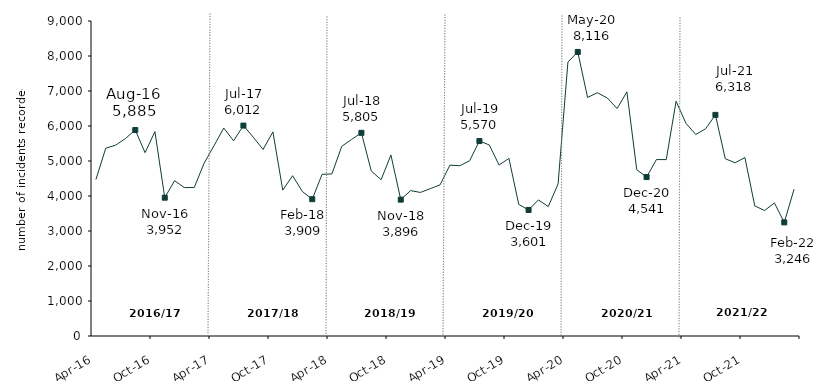
| Category | Series 0 |
|---|---|
| 2016-04-01 | 4472 |
| 2016-05-01 | 5366 |
| 2016-06-01 | 5452 |
| 2016-07-01 | 5641 |
| 2016-08-01 | 5885 |
| 2016-09-01 | 5238 |
| 2016-10-01 | 5840 |
| 2016-11-01 | 3952 |
| 2016-12-01 | 4437 |
| 2017-01-01 | 4240 |
| 2017-02-01 | 4244 |
| 2017-03-01 | 4936 |
| 2017-04-01 | 5433 |
| 2017-05-01 | 5941 |
| 2017-06-01 | 5577 |
| 2017-07-01 | 6012 |
| 2017-08-01 | 5681 |
| 2017-09-01 | 5329 |
| 2017-10-01 | 5832 |
| 2017-11-01 | 4167 |
| 2017-12-01 | 4580 |
| 2018-01-01 | 4127 |
| 2018-02-01 | 3909 |
| 2018-03-01 | 4619 |
| 2018-04-01 | 4631 |
| 2018-05-01 | 5420 |
| 2018-06-01 | 5616 |
| 2018-07-01 | 5805 |
| 2018-08-01 | 4716 |
| 2018-09-01 | 4464 |
| 2018-10-01 | 5172 |
| 2018-11-01 | 3896 |
| 2018-12-01 | 4154 |
| 2019-01-01 | 4102 |
| 2019-02-01 | 4209 |
| 2019-03-01 | 4318 |
| 2019-04-01 | 4881 |
| 2019-05-01 | 4864 |
| 2019-06-01 | 5007 |
| 2019-07-01 | 5570 |
| 2019-08-01 | 5459 |
| 2019-09-01 | 4884 |
| 2019-10-01 | 5076 |
| 2019-11-01 | 3759 |
| 2019-12-01 | 3601 |
| 2020-01-01 | 3888 |
| 2020-02-01 | 3698 |
| 2020-03-01 | 4344 |
| 2020-04-01 | 7825 |
| 2020-05-01 | 8116 |
| 2020-06-01 | 6816 |
| 2020-07-01 | 6950 |
| 2020-08-01 | 6801 |
| 2020-09-01 | 6500 |
| 2020-10-01 | 6975 |
| 2020-11-01 | 4751 |
| 2020-12-01 | 4541 |
| 2021-01-01 | 5041 |
| 2021-02-01 | 5040 |
| 2021-03-01 | 6707 |
| 2021-04-01 | 6079 |
| 2021-05-01 | 5757 |
| 2021-06-01 | 5920 |
| 2021-07-01 | 6318 |
| 2021-08-01 | 5065 |
| 2021-09-01 | 4949 |
| 2021-10-01 | 5099 |
| 2021-11-01 | 3717 |
| 2021-12-01 | 3585 |
| 2022-01-01 | 3802 |
| 2022-02-01 | 3246 |
| 2022-03-01 | 4195 |